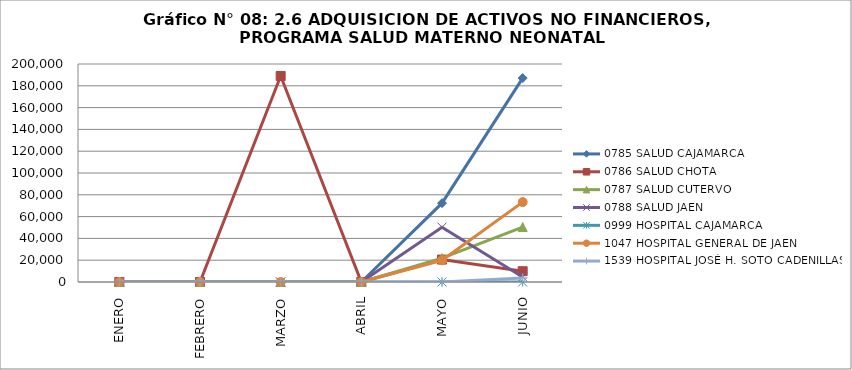
| Category | 0785 SALUD CAJAMARCA | 0786 SALUD CHOTA | 0787 SALUD CUTERVO | 0788 SALUD JAEN | 0999 HOSPITAL CAJAMARCA | 1047 HOSPITAL GENERAL DE JAEN | 1539 HOSPITAL JOSÉ H. SOTO CADENILLAS |
|---|---|---|---|---|---|---|---|
| ENERO | 0 | 0 | 0 | 0 | 0 | 0 | 0 |
| FEBRERO | 0 | 0 | 0 | 0 | 0 | 0 | 0 |
| MARZO | 0 | 189000 | 0 | 0 | 0 | 0 | 0 |
| ABRIL | 0 | 0 | 0 | 0 | 0 | 0 | 0 |
| MAYO | 72317 | 20583 | 21896 | 50298 | 0 | 19936 | 0 |
| JUNIO | 187080 | 9900 | 50407 | 4650 | 0 | 73305 | 3766 |